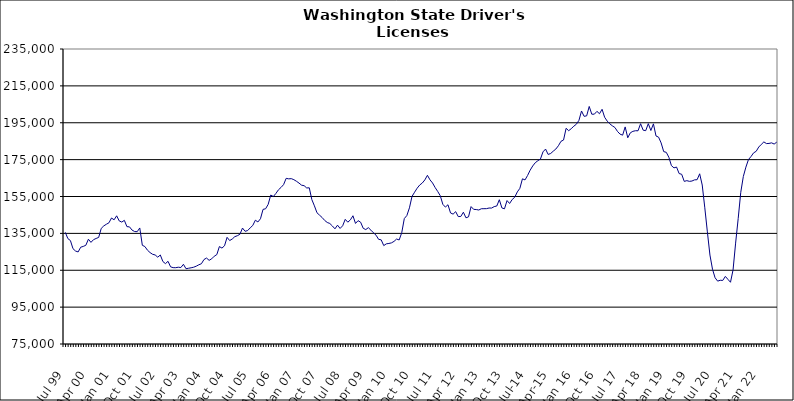
| Category | Series 0 |
|---|---|
| Jul 99 | 135560 |
| Aug 99 | 132182 |
| Sep 99 | 131104 |
| Oct 99 | 126694 |
| Nov 99 | 125425 |
| Dec 99 | 124927 |
| Jan 00 | 127499 |
| Feb 00 | 127927 |
| Mar 00 | 128547 |
| Apr 00 | 131834 |
| May 00 | 130120 |
| Jun 00 | 131595 |
| Jul 00 | 132236 |
| Aug 00 | 132819 |
| Sep 00 | 137711 |
| Oct 00 | 139063 |
| Nov 00 | 139952 |
| Dec 00 | 140732 |
| Jan 01 | 143338 |
| Feb 01 | 142359 |
| Mar 01 | 144523 |
| Apr 01 | 141758 |
| May 01 | 141135 |
| Jun 01 | 142064 |
| Jul 01 | 138646 |
| Aug 01 | 138530 |
| Sep 01 | 136784 |
| Oct 01 | 135996 |
| Nov 01 | 135917 |
| Dec 01 | 137940 |
| Jan 02 | 128531 |
| Feb 02 | 127848 |
| Mar 02 | 125876 |
| Apr 02 | 124595 |
| May 02 | 123660 |
| Jun 02 | 123282 |
| Jul 02 | 122089 |
| Aug 02 | 123279 |
| Sep 02 | 119727 |
| Oct 02 | 118588 |
| Nov 02 | 119854 |
| Dec 02 | 116851 |
| Jan 03 | 116407 |
| Feb 03 | 116382 |
| Mar 03 | 116648 |
| Apr 03 | 116471 |
| May 03 | 118231 |
| Jun 03 | 115831 |
| Jul 03 | 116082 |
| Aug 03 | 116341 |
| Sep 03 | 116653 |
| Oct 03 | 117212 |
| Nov 03 | 117962 |
| Dec 03 | 118542 |
| Jan 04 | 120817 |
| Feb 04 | 121617 |
| Mar 04 | 120369 |
| Apr 04 | 121200 |
| May 04 | 122609 |
| Jun 04 | 123484 |
| Jul 04 | 127844 |
| Aug 04 | 127025 |
| Sep 04 | 128273 |
| Oct 04 | 132853 |
| Nov 04 | 131106 |
| Dec 04 | 131935 |
| Jan 05 | 133205 |
| Feb 05 | 133736 |
| Mar 05 | 134528 |
| Apr 05 | 137889 |
| May 05 | 136130 |
| Jun 05 | 136523 |
| Jul 05 | 137997 |
| Aug 05 | 139294 |
| Sep 05 | 142140 |
| Oct 05 | 141192 |
| Nov 05 | 142937 |
| Dec 05 | 148013 |
| Jan 06 | 148341 |
| Feb 06 | 150744 |
| Mar 06 | 155794 |
| Apr 06 | 154984 |
| May 06 | 156651 |
| Jun 06 | 158638 |
| Jul 06 | 159911 |
| Aug 06 | 161445 |
| Sep 06 | 164852 |
| Oct 06 | 164570 |
| Nov 06 | 164679 |
| Dec 06 | 164127 |
| Jan 07 | 163271 |
| Feb 07 | 162273 |
| Mar 07 | 161140 |
| Apr 07 | 160860 |
| May 07 | 159633 |
| Jun 07 | 159724 |
| Jul 07 | 153303 |
| Aug 07 | 149939 |
| Sep 07 | 146172 |
| Oct 07 | 144876 |
| Nov 07 | 143613 |
| Dec 07 | 142022 |
| Jan 08 | 140909 |
| Feb 08 | 140368 |
| Mar 08 | 138998 |
| Apr 08 | 137471 |
| May 08 | 139453 |
| Jun 08 | 137680 |
| Jul 08 | 139120 |
| Aug 08 | 142612 |
| Sep-08 | 141071 |
| Oct 08 | 142313 |
| Nov 08 | 144556 |
| Dec 08 | 140394 |
| Jan 09 | 141903 |
| Feb 09 | 141036 |
| Mar 09 | 137751 |
| Apr 09 | 137060 |
| May 09 | 138101 |
| Jun 09 | 136739 |
| Jul 09 | 135317 |
| Aug 09 | 134020 |
| Sep 09 | 131756 |
| Oct 09 | 131488 |
| Nov 09 | 128370 |
| Dec 09 | 129323 |
| Jan 10 | 129531 |
| Feb 10 | 129848 |
| Mar 10 | 130654 |
| Apr 10 | 131929 |
| May 10 | 131429 |
| Jun 10 | 135357 |
| Jul 10 | 143032 |
| Aug 10 | 144686 |
| Sep 10 | 148856 |
| Oct 10 | 155042 |
| Nov 10 | 157328 |
| Dec 10 | 159501 |
| Jan 11 | 161221 |
| Feb 11 | 162312 |
| Mar 11 | 163996 |
| Apr 11 | 166495 |
| May 11 | 164040 |
| Jun 11 | 162324 |
| Jul 11 | 159862 |
| Aug 11 | 157738 |
| Sep 11 | 155430 |
| Oct 11 | 150762 |
| Nov 11 | 149255 |
| Dec 11 | 150533 |
| Jan 12 | 146068 |
| Feb 12 | 145446 |
| Mar 12 | 146788 |
| Apr 12 | 144110 |
| May 12 | 144162 |
| Jun 12 | 146482 |
| Jul 12 | 143445 |
| Aug 12 | 143950 |
| Sep 12 | 149520 |
| Oct 12 | 148033 |
| Nov 12 | 147926 |
| Dec 12 | 147674 |
| Jan 13 | 148360 |
| Feb-13 | 148388 |
| Mar-13 | 148414 |
| Apr 13 | 148749 |
| May 13 | 148735 |
| Jun-13 | 149521 |
| Jul 13 | 149837 |
| Aug 13 | 153252 |
| Sep 13 | 148803 |
| Oct 13 | 148315 |
| Nov 13 | 152804 |
| Dec 13 | 151209 |
| Jan 14 | 153357 |
| Feb-14 | 154608 |
| Mar 14 | 157479 |
| Apr 14 | 159441 |
| May 14 | 164591 |
| Jun 14 | 163995 |
| Jul-14 | 166411 |
| Aug-14 | 169272 |
| Sep 14 | 171565 |
| Oct 14 | 173335 |
| Nov 14 | 174406 |
| Dec 14 | 175302 |
| Jan 15 | 179204 |
| Feb 15 | 180737 |
| Mar 15 | 177810 |
| Apr-15 | 178331 |
| May 15 | 179601 |
| Jun-15 | 180729 |
| Jul 15 | 182540 |
| Aug 15 | 184924 |
| Sep 15 | 185620 |
| Oct 15 | 192002 |
| Nov 15 | 190681 |
| Dec 15 | 191795 |
| Jan 16 | 193132 |
| Feb 16 | 194206 |
| Mar 16 | 196319 |
| Apr 16 | 201373 |
| May 16 | 198500 |
| Jun 16 | 198743 |
| Jul 16 | 203841 |
| Aug 16 | 199630 |
| Sep 16 | 199655 |
| Oct 16 | 201181 |
| Nov 16 | 199888 |
| Dec 16 | 202304 |
| Jan 17 | 197977 |
| Feb 17 | 195889 |
| Mar 17 | 194438 |
| Apr 17 | 193335 |
| May 17 | 192430 |
| Jun 17 | 190298 |
| Jul 17 | 188832 |
| Aug 17 | 188264 |
| Sep 17 | 192738 |
| Oct 17 | 186856 |
| Nov 17 | 189537 |
| Dec 17 | 190341 |
| Jan 18 | 190670 |
| Feb 18 | 190645 |
| Mar 18 | 194476 |
| Apr 18 | 190971 |
| May 18 | 190707 |
| Jun 18 | 194516 |
| Jul 18 | 190783 |
| Aug 18 | 194390 |
| Sep 18 | 187831 |
| Oct 18 | 187188 |
| Nov 18 | 184054 |
| Dec 18 | 179347 |
| Jan 19 | 178958 |
| Feb 19 | 176289 |
| Mar 19 | 171747 |
| Apr 19 | 170532 |
| May 19 | 170967 |
| Jun 19 | 167444 |
| Jul 19 | 167059 |
| Aug 19 | 163194 |
| Sep 19 | 163599 |
| Oct 19 | 163212 |
| Nov 19 | 163388 |
| Dec 19 | 164024 |
| Jan 20 | 164114 |
| Feb 20 | 167320 |
| Mar 20 | 161221 |
| Apr 20 | 148866 |
| May 20 | 135821 |
| Jun 20 | 123252 |
| Jul 20 | 115526 |
| Aug 20 | 110940 |
| Sep 20 | 109099 |
| Oct 20 | 109566 |
| Nov 20 | 109488 |
| Dec 20 | 111658 |
| Jan 21 | 110070 |
| Feb 21 | 108491 |
| Mar 21 | 115176 |
| Apr 21 | 129726 |
| May 21 | 143052 |
| Jun 21 | 157253 |
| Jul 21 | 165832 |
| Aug 21 | 170937 |
| Sep 21 | 175042 |
| Oct 21 | 176696 |
| Nov 21 | 178677 |
| Dec 21 | 179501 |
| Jan 22 | 181825 |
| Feb 22 | 183258 |
| Mar 22 | 184618 |
| Apr 22 | 183710 |
| May 22 | 183784 |
| Jun 22 | 184101 |
| Jul 22 | 183443 |
| Aug 22 | 184475 |